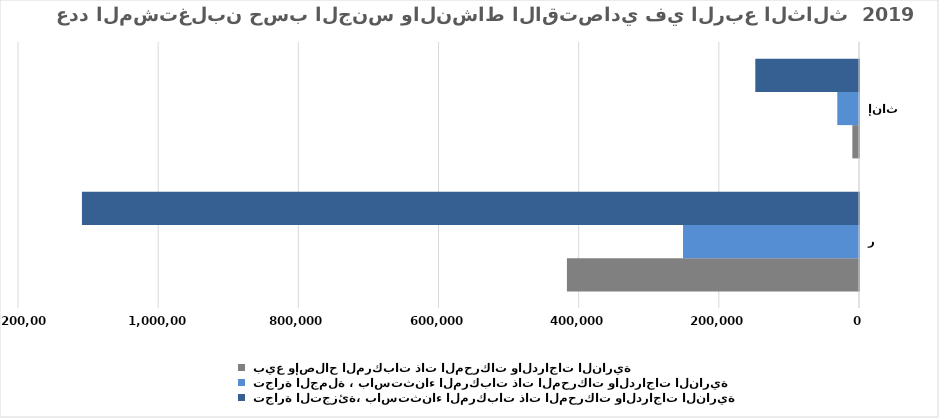
| Category |  بيع وإصلاح المركبات ذات المحركات والدراجات النارية |  تجارة الجملة ، باستثناء المركبات ذات المحركات والدراجات النارية |  تجارة التجزئة، باستثناء المركبات ذات المحركات والدراجات النارية |
|---|---|---|---|
| ذكور | 416762 | 251103 | 1108772 |
| إناث | 9500 | 30960 | 147966 |